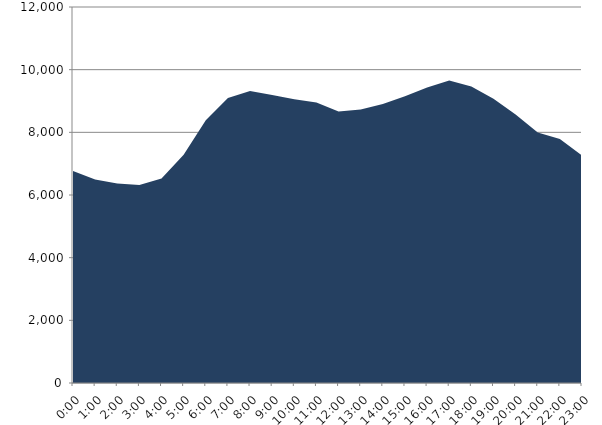
| Category | Series 0 | Series 1 |
|---|---|---|
| 2023-11-15 |  | 6769.34 |
| 2023-11-15 01:00:00 |  | 6494.02 |
| 2023-11-15 02:00:00 |  | 6364.26 |
| 2023-11-15 03:00:00 |  | 6320.02 |
| 2023-11-15 04:00:00 |  | 6525.84 |
| 2023-11-15 05:00:00 |  | 7286.25 |
| 2023-11-15 06:00:00 |  | 8382.25 |
| 2023-11-15 07:00:00 |  | 9093.06 |
| 2023-11-15 08:00:00 |  | 9322.34 |
| 2023-11-15 09:00:00 |  | 9189.84 |
| 2023-11-15 10:00:00 |  | 9055.48 |
| 2023-11-15 11:00:00 |  | 8949.1 |
| 2023-11-15 12:00:00 |  | 8664.06 |
| 2023-11-15 13:00:00 |  | 8729.61 |
| 2023-11-15 14:00:00 |  | 8903.71 |
| 2023-11-15 15:00:00 |  | 9149.28 |
| 2023-11-15 16:00:00 |  | 9430.86 |
| 2023-11-15 17:00:00 |  | 9652.37 |
| 2023-11-15 18:00:00 |  | 9465.19 |
| 2023-11-15 19:00:00 |  | 9070.2 |
| 2023-11-15 20:00:00 |  | 8567.98 |
| 2023-11-15 21:00:00 |  | 7991.77 |
| 2023-11-15 22:00:00 |  | 7789.16 |
| 2023-11-15 23:00:00 |  | 7259.63 |